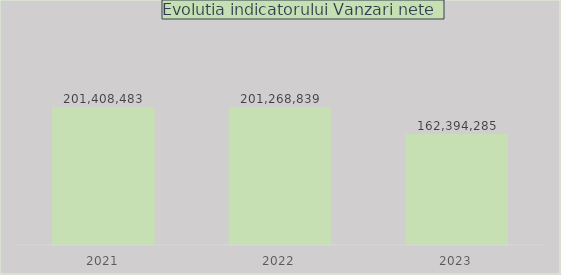
| Category | Series 0 |
|---|---|
| 2021.0 | 201408483 |
| 2022.0 | 201268839 |
| 2023.0 | 162394285 |